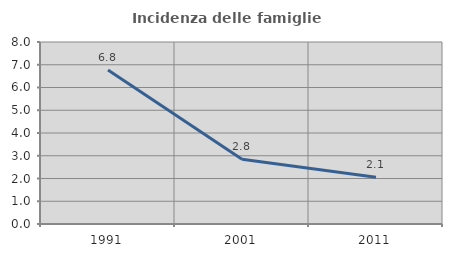
| Category | Incidenza delle famiglie numerose |
|---|---|
| 1991.0 | 6.765 |
| 2001.0 | 2.847 |
| 2011.0 | 2.058 |